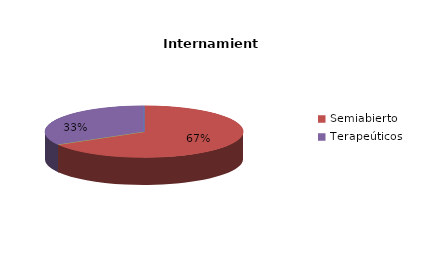
| Category | Series 0 |
|---|---|
| Cerrado | 0 |
| Semiabierto | 2 |
| Abierto | 0 |
| Terapeúticos | 1 |